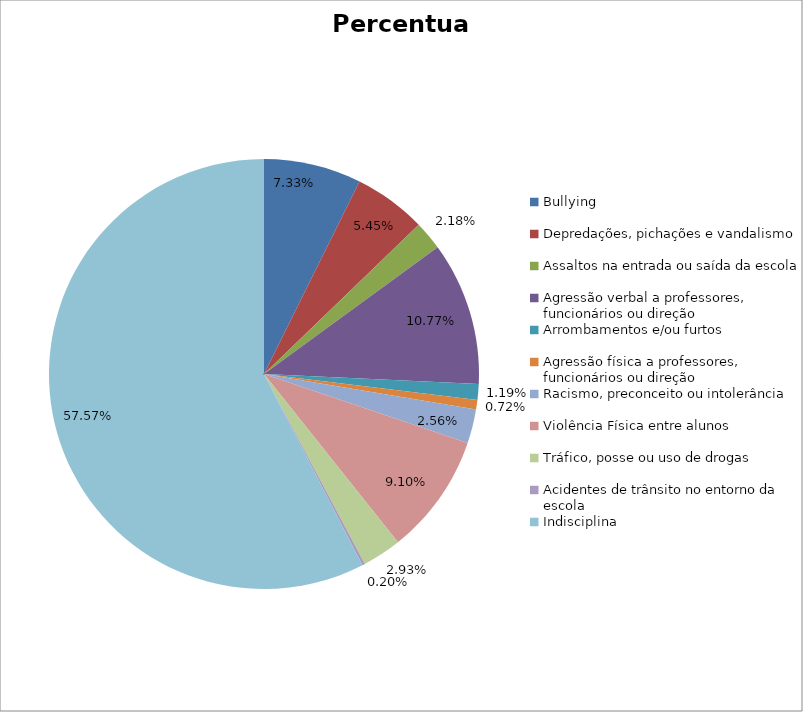
| Category | Percentual |
|---|---|
| Bullying | 0.073 |
| Depredações, pichações e vandalismo | 0.055 |
| Assaltos na entrada ou saída da escola | 0.022 |
| Agressão verbal a professores, funcionários ou direção | 0.108 |
| Arrombamentos e/ou furtos | 0.012 |
| Agressão física a professores, funcionários ou direção | 0.007 |
| Racismo, preconceito ou intolerância | 0.026 |
| Violência Física entre alunos | 0.091 |
| Tráfico, posse ou uso de drogas | 0.029 |
| Acidentes de trânsito no entorno da escola | 0.002 |
| Indisciplina | 0.576 |